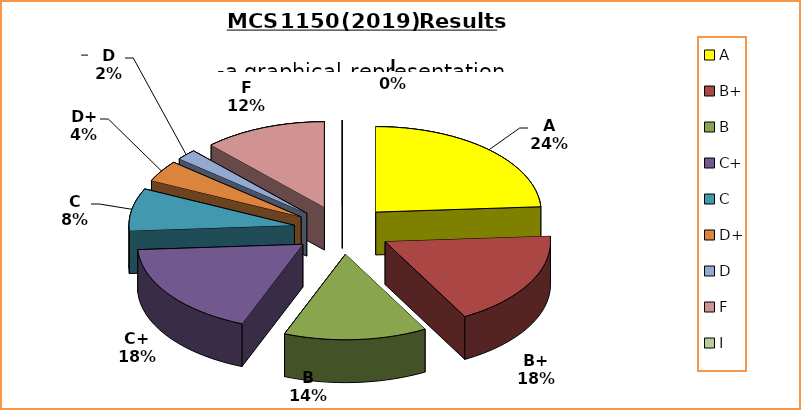
| Category | Series 0 |
|---|---|
| A | 12 |
| B+ | 9 |
| B | 7 |
| C+ | 9 |
| C | 4 |
| D+ | 2 |
| D | 1 |
| F | 6 |
| I | 0 |